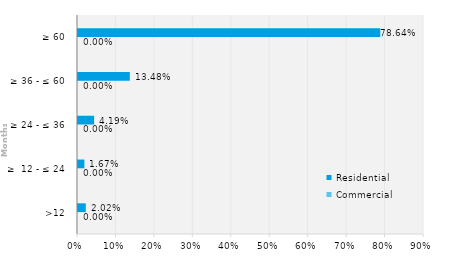
| Category | Commercial | Residential |
|---|---|---|
| >12 | 0 | 0.02 |
| ≥  12 - ≤ 24 | 0 | 0.017 |
| ≥ 24 - ≤ 36 | 0 | 0.042 |
| ≥ 36 - ≤ 60 | 0 | 0.135 |
| ≥ 60 | 0 | 0.786 |